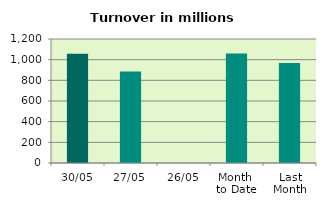
| Category | Series 0 |
|---|---|
| 30/05 | 1056.284 |
| 27/05 | 886.046 |
| 26/05 | 0 |
| Month 
to Date | 1060.202 |
| Last
Month | 968.247 |